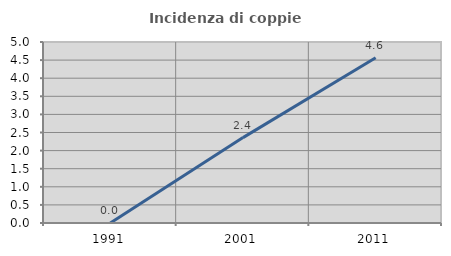
| Category | Incidenza di coppie miste |
|---|---|
| 1991.0 | 0 |
| 2001.0 | 2.359 |
| 2011.0 | 4.567 |